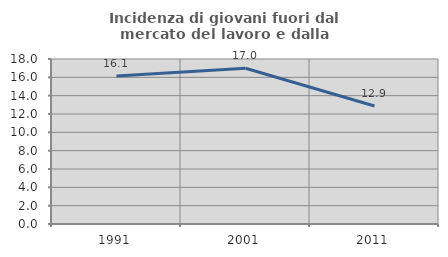
| Category | Incidenza di giovani fuori dal mercato del lavoro e dalla formazione  |
|---|---|
| 1991.0 | 16.149 |
| 2001.0 | 16.996 |
| 2011.0 | 12.876 |